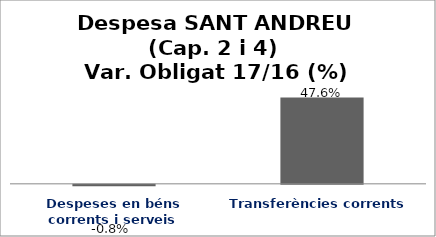
| Category | Series 0 |
|---|---|
| Despeses en béns corrents i serveis | -0.008 |
| Transferències corrents | 0.476 |